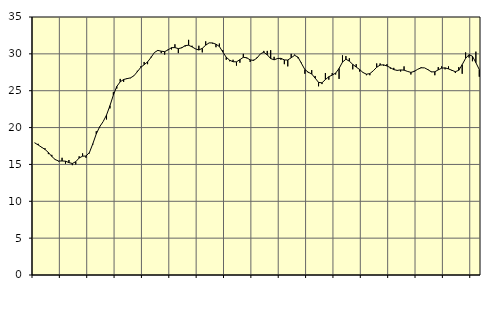
| Category | Piggar | Series 1 |
|---|---|---|
| nan | 17.9 | 17.93 |
| 87.0 | 17.8 | 17.64 |
| 87.0 | 17.3 | 17.34 |
| 87.0 | 17.2 | 17.04 |
| nan | 16.4 | 16.62 |
| 88.0 | 16.3 | 16.08 |
| 88.0 | 15.6 | 15.66 |
| 88.0 | 15.4 | 15.46 |
| nan | 15.9 | 15.47 |
| 89.0 | 15.1 | 15.44 |
| 89.0 | 15.6 | 15.25 |
| 89.0 | 14.9 | 15.13 |
| nan | 15 | 15.37 |
| 90.0 | 16.1 | 15.87 |
| 90.0 | 16.5 | 16.12 |
| 90.0 | 15.9 | 16.14 |
| nan | 16.5 | 16.62 |
| 91.0 | 17.7 | 17.81 |
| 91.0 | 19.5 | 19.14 |
| 91.0 | 20 | 20.11 |
| nan | 20.8 | 20.8 |
| 92.0 | 21.1 | 21.7 |
| 92.0 | 22.6 | 22.97 |
| 92.0 | 24.8 | 24.41 |
| nan | 25.3 | 25.58 |
| 93.0 | 26.6 | 26.21 |
| 93.0 | 26.2 | 26.52 |
| 93.0 | 26.7 | 26.64 |
| nan | 26.7 | 26.74 |
| 94.0 | 27 | 27.02 |
| 94.0 | 27.7 | 27.57 |
| 94.0 | 28.3 | 28.16 |
| nan | 28.9 | 28.53 |
| 95.0 | 28.6 | 28.91 |
| 95.0 | 29.6 | 29.51 |
| 95.0 | 30.2 | 30.18 |
| nan | 30.4 | 30.47 |
| 96.0 | 30.1 | 30.36 |
| 96.0 | 29.9 | 30.3 |
| 96.0 | 30.6 | 30.54 |
| nan | 30.6 | 30.84 |
| 97.0 | 31.3 | 30.85 |
| 97.0 | 30.1 | 30.71 |
| 97.0 | 30.9 | 30.82 |
| nan | 31 | 31.12 |
| 98.0 | 31.9 | 31.17 |
| 98.0 | 31.1 | 30.95 |
| 98.0 | 30.7 | 30.68 |
| nan | 31.1 | 30.52 |
| 99.0 | 30.2 | 30.75 |
| 99.0 | 31.7 | 31.18 |
| 99.0 | 31.5 | 31.49 |
| nan | 31.4 | 31.48 |
| 0.0 | 30.9 | 31.31 |
| 0.0 | 31.4 | 31 |
| 0.0 | 30.5 | 30.25 |
| nan | 29.2 | 29.54 |
| 1.0 | 29 | 29.14 |
| 1.0 | 29.2 | 28.93 |
| 1.0 | 28.4 | 28.92 |
| nan | 28.8 | 29.21 |
| 2.0 | 30 | 29.53 |
| 2.0 | 29.4 | 29.47 |
| 2.0 | 28.9 | 29.18 |
| nan | 29.2 | 29.11 |
| 3.0 | 29.5 | 29.44 |
| 3.0 | 30 | 30 |
| 3.0 | 30.4 | 30.22 |
| nan | 30.4 | 29.87 |
| 4.0 | 30.5 | 29.36 |
| 4.0 | 29.6 | 29.19 |
| 4.0 | 29.4 | 29.37 |
| nan | 29.2 | 29.39 |
| 5.0 | 28.6 | 29.18 |
| 5.0 | 28.3 | 29.16 |
| 5.0 | 30 | 29.47 |
| nan | 29.9 | 29.8 |
| 6.0 | 29.4 | 29.55 |
| 6.0 | 28.8 | 28.7 |
| 6.0 | 27.3 | 27.87 |
| nan | 27.4 | 27.51 |
| 7.0 | 27.8 | 27.27 |
| 7.0 | 27 | 26.71 |
| 7.0 | 25.6 | 26.13 |
| nan | 25.9 | 26.07 |
| 8.0 | 27.4 | 26.51 |
| 8.0 | 26.5 | 26.9 |
| 8.0 | 27.4 | 27.12 |
| nan | 27.2 | 27.39 |
| 9.0 | 26.6 | 28.02 |
| 9.0 | 29.8 | 28.88 |
| 9.0 | 29.7 | 29.27 |
| nan | 29.4 | 29.01 |
| 10.0 | 27.9 | 28.57 |
| 10.0 | 28.6 | 28.21 |
| 10.0 | 27.6 | 27.88 |
| nan | 27.5 | 27.47 |
| 11.0 | 27.1 | 27.24 |
| 11.0 | 27.1 | 27.32 |
| 11.0 | 27.7 | 27.7 |
| nan | 28.7 | 28.18 |
| 12.0 | 28.7 | 28.48 |
| 12.0 | 28.4 | 28.51 |
| 12.0 | 28.6 | 28.36 |
| nan | 28 | 28.13 |
| 13.0 | 28.1 | 27.86 |
| 13.0 | 27.7 | 27.76 |
| 13.0 | 27.6 | 27.82 |
| nan | 28.3 | 27.79 |
| 14.0 | 27.6 | 27.62 |
| 14.0 | 27.2 | 27.49 |
| 14.0 | 27.7 | 27.62 |
| nan | 27.9 | 27.91 |
| 15.0 | 28.2 | 28.11 |
| 15.0 | 28.1 | 28.1 |
| 15.0 | 27.9 | 27.85 |
| nan | 27.6 | 27.55 |
| 16.0 | 27.1 | 27.57 |
| 16.0 | 28.2 | 27.83 |
| 16.0 | 28.3 | 28.06 |
| nan | 27.9 | 28.1 |
| 17.0 | 28.3 | 27.96 |
| 17.0 | 27.7 | 27.77 |
| 17.0 | 27.4 | 27.58 |
| nan | 28.2 | 27.77 |
| 18.0 | 27.3 | 28.54 |
| 18.0 | 30.2 | 29.39 |
| 18.0 | 29.5 | 29.89 |
| nan | 29 | 29.68 |
| 19.0 | 30.3 | 28.81 |
| 19.0 | 26.9 | 27.87 |